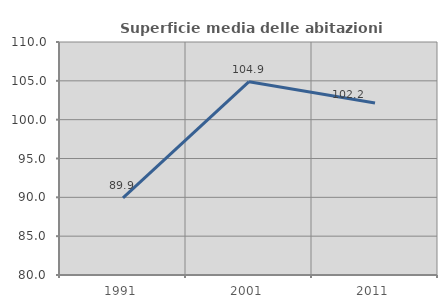
| Category | Superficie media delle abitazioni occupate |
|---|---|
| 1991.0 | 89.934 |
| 2001.0 | 104.893 |
| 2011.0 | 102.15 |